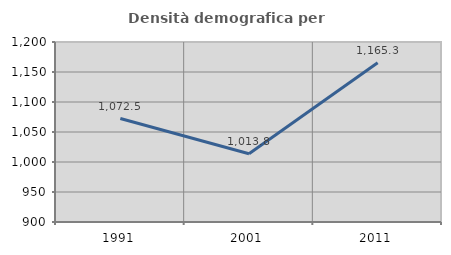
| Category | Densità demografica |
|---|---|
| 1991.0 | 1072.499 |
| 2001.0 | 1013.83 |
| 2011.0 | 1165.313 |